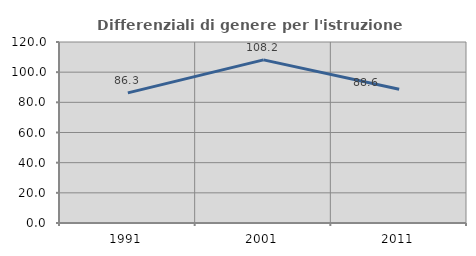
| Category | Differenziali di genere per l'istruzione superiore |
|---|---|
| 1991.0 | 86.275 |
| 2001.0 | 108.155 |
| 2011.0 | 88.615 |